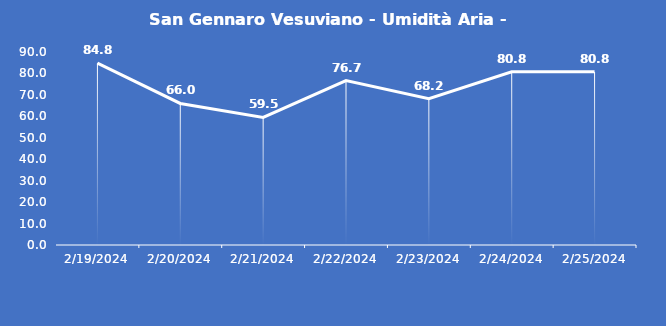
| Category | San Gennaro Vesuviano - Umidità Aria - Grezzo (%) |
|---|---|
| 2/19/24 | 84.8 |
| 2/20/24 | 66 |
| 2/21/24 | 59.5 |
| 2/22/24 | 76.7 |
| 2/23/24 | 68.2 |
| 2/24/24 | 80.8 |
| 2/25/24 | 80.8 |